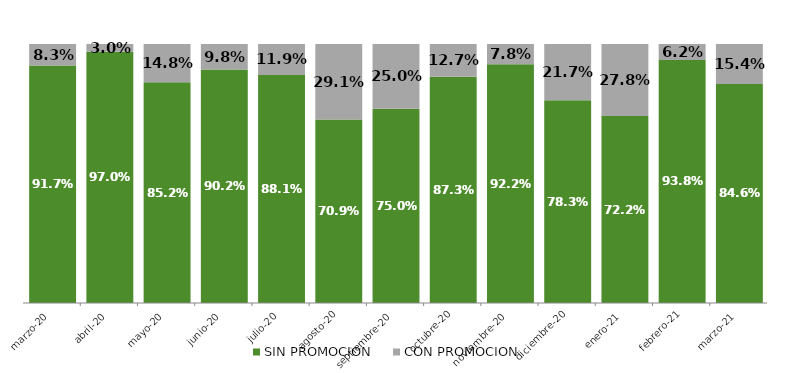
| Category | SIN PROMOCION   | CON PROMOCION   |
|---|---|---|
| 2020-03-01 | 0.917 | 0.083 |
| 2020-04-01 | 0.97 | 0.03 |
| 2020-05-01 | 0.852 | 0.148 |
| 2020-06-01 | 0.902 | 0.098 |
| 2020-07-01 | 0.881 | 0.119 |
| 2020-08-01 | 0.709 | 0.291 |
| 2020-09-01 | 0.75 | 0.25 |
| 2020-10-01 | 0.873 | 0.127 |
| 2020-11-01 | 0.922 | 0.078 |
| 2020-12-01 | 0.783 | 0.217 |
| 2021-01-01 | 0.722 | 0.278 |
| 2021-02-01 | 0.938 | 0.062 |
| 2021-03-01 | 0.846 | 0.154 |